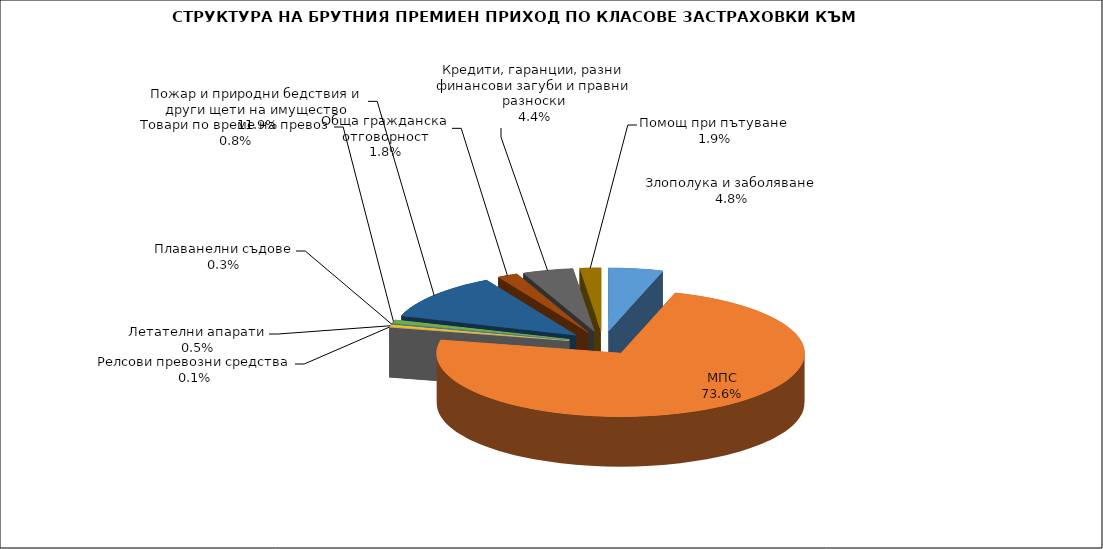
| Category | Злополука и заболяване |
|---|---|
| Злополука и заболяване | 0.048 |
| МПС | 0.736 |
| Релсови превозни средства | 0.001 |
| Летателни апарати | 0.005 |
| Плаванелни съдове | 0.003 |
| Товари по време на превоз | 0.008 |
| Пожар и природни бедствия и други щети на имущество | 0.119 |
| Обща гражданска отговорност | 0.018 |
| Кредити, гаранции, разни финансови загуби и правни разноски | 0.044 |
| Помощ при пътуване | 0.019 |